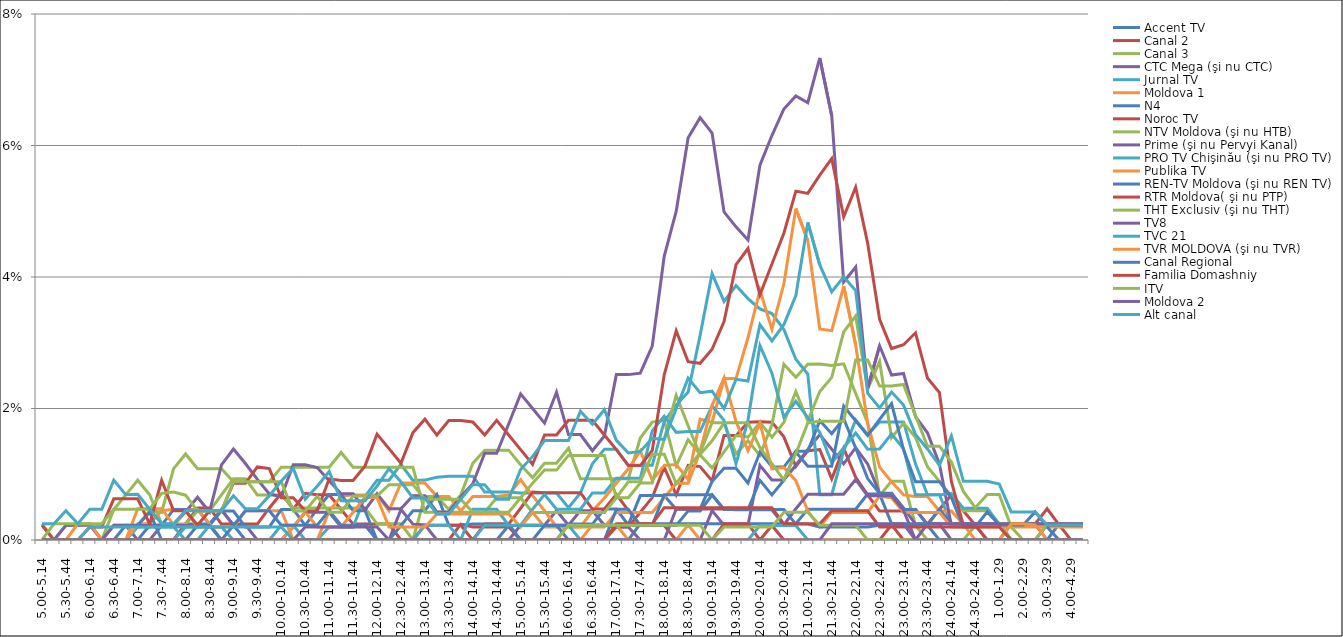
| Category | Accent TV | Canal 2 | Canal 3 | CTC Mega (şi nu CTC) | Jurnal TV | Moldova 1 | N4 | Noroc TV | NTV Moldova (şi nu HTB) | Prime (şi nu Pervyi Kanal) | PRO TV Chişinău (şi nu PRO TV) | Publika TV  | REN-TV Moldova (şi nu REN TV)  | RTR Moldova( şi nu PTP)  | THT Exclusiv (şi nu THT) | TV8 | TVC 21 | TVR MOLDOVA (şi nu TVR) | Canal Regional | Familia Domashniy | ITV | Moldova 2 | Alt canal |
|---|---|---|---|---|---|---|---|---|---|---|---|---|---|---|---|---|---|---|---|---|---|---|---|
| 5.00-5.14 | 0 | 0 | 0 | 0 | 0 | 0 | 0 | 0 | 0 | 0 | 0 | 0.002 | 0 | 0.002 | 0 | 0 | 0 | 0 | 0 | 0 | 0 | 0 | 0.002 |
| 5.15-5.29 | 0 | 0 | 0 | 0 | 0 | 0 | 0 | 0 | 0 | 0 | 0 | 0 | 0 | 0 | 0.002 | 0 | 0 | 0 | 0 | 0 | 0 | 0 | 0.002 |
| 5.30-5.44 | 0 | 0 | 0.002 | 0 | 0 | 0 | 0 | 0 | 0 | 0.002 | 0 | 0 | 0 | 0 | 0.002 | 0 | 0 | 0 | 0 | 0 | 0 | 0 | 0.004 |
| 5.45-5.59 | 0 | 0 | 0.002 | 0 | 0 | 0 | 0 | 0 | 0 | 0.002 | 0 | 0.002 | 0 | 0 | 0.002 | 0 | 0 | 0 | 0 | 0 | 0 | 0 | 0.002 |
| 6.00-6.14 | 0 | 0 | 0.002 | 0 | 0 | 0 | 0 | 0 | 0 | 0.002 | 0 | 0.002 | 0 | 0.002 | 0.002 | 0 | 0.002 | 0 | 0 | 0 | 0 | 0 | 0.005 |
| 6.15-6.29 | 0 | 0 | 0 | 0 | 0 | 0 | 0 | 0 | 0 | 0 | 0 | 0 | 0 | 0.002 | 0.002 | 0 | 0.002 | 0 | 0 | 0 | 0 | 0 | 0.005 |
| 6.30-6.44 | 0 | 0 | 0.005 | 0.002 | 0 | 0 | 0 | 0 | 0.002 | 0.002 | 0 | 0 | 0 | 0.006 | 0.005 | 0 | 0.002 | 0 | 0 | 0 | 0 | 0 | 0.009 |
| 6.45-6.59 | 0 | 0 | 0.007 | 0.002 | 0 | 0 | 0 | 0 | 0.002 | 0.002 | 0 | 0 | 0.002 | 0.006 | 0.005 | 0 | 0.002 | 0 | 0 | 0 | 0 | 0 | 0.007 |
| 7.00-7.14 | 0 | 0 | 0.009 | 0 | 0.002 | 0.002 | 0 | 0 | 0.002 | 0.002 | 0 | 0.005 | 0.002 | 0.006 | 0.005 | 0 | 0.002 | 0 | 0 | 0 | 0 | 0 | 0.007 |
| 7.15-7.29 | 0 | 0 | 0.007 | 0 | 0.002 | 0.002 | 0.002 | 0 | 0.004 | 0.002 | 0 | 0.005 | 0.004 | 0.002 | 0.005 | 0 | 0.002 | 0 | 0 | 0 | 0 | 0 | 0.005 |
| 7.30-7.44 | 0 | 0 | 0.002 | 0.002 | 0.002 | 0.004 | 0.002 | 0 | 0.004 | 0.002 | 0 | 0.005 | 0 | 0.009 | 0.007 | 0 | 0.002 | 0 | 0 | 0 | 0 | 0 | 0.002 |
| 7.45-7.59 | 0 | 0 | 0.002 | 0.002 | 0.002 | 0.005 | 0.005 | 0 | 0.011 | 0.002 | 0 | 0.002 | 0 | 0.004 | 0.007 | 0 | 0.002 | 0 | 0 | 0 | 0 | 0 | 0.002 |
| 8.00-8.14 | 0.002 | 0.002 | 0.002 | 0.002 | 0 | 0.004 | 0.005 | 0 | 0.013 | 0.004 | 0.002 | 0.005 | 0 | 0.004 | 0.007 | 0 | 0.002 | 0 | 0 | 0 | 0 | 0 | 0.004 |
| 8.15-8.29 | 0.002 | 0.005 | 0.004 | 0.002 | 0 | 0.002 | 0.005 | 0 | 0.011 | 0.007 | 0.002 | 0.005 | 0.002 | 0.002 | 0.004 | 0 | 0.002 | 0 | 0 | 0 | 0 | 0 | 0.004 |
| 8.30-8.44 | 0.002 | 0.005 | 0.004 | 0.002 | 0.002 | 0.002 | 0.002 | 0 | 0.011 | 0.004 | 0.002 | 0.002 | 0.002 | 0.004 | 0.004 | 0 | 0.002 | 0 | 0 | 0 | 0 | 0 | 0.004 |
| 8.45-8.59 | 0.005 | 0.002 | 0.007 | 0.005 | 0 | 0.002 | 0.004 | 0 | 0.011 | 0.011 | 0.002 | 0 | 0 | 0.004 | 0.004 | 0 | 0.002 | 0 | 0 | 0 | 0 | 0 | 0.004 |
| 9.00-9.14 | 0.002 | 0.002 | 0.009 | 0.002 | 0 | 0.002 | 0.004 | 0 | 0.009 | 0.014 | 0 | 0 | 0.002 | 0.009 | 0.009 | 0 | 0.002 | 0 | 0 | 0 | 0 | 0 | 0.007 |
| 9.15-9.29 | 0 | 0.002 | 0.009 | 0.002 | 0 | 0.004 | 0.002 | 0 | 0.009 | 0.012 | 0 | 0 | 0.004 | 0.009 | 0.009 | 0 | 0.002 | 0 | 0 | 0 | 0 | 0 | 0.005 |
| 9.30-9.44 | 0 | 0.002 | 0.007 | 0 | 0 | 0.004 | 0.002 | 0 | 0.009 | 0.009 | 0 | 0 | 0.004 | 0.011 | 0.009 | 0 | 0.002 | 0 | 0 | 0 | 0 | 0 | 0.005 |
| 9.45-9.59 | 0 | 0.005 | 0.007 | 0 | 0 | 0.004 | 0.002 | 0 | 0.009 | 0.007 | 0 | 0 | 0.004 | 0.011 | 0.009 | 0 | 0.002 | 0 | 0 | 0 | 0 | 0 | 0.007 |
| 10.00-10.14 | 0 | 0.007 | 0.007 | 0 | 0.002 | 0.004 | 0.005 | 0 | 0.011 | 0.007 | 0 | 0 | 0.002 | 0.006 | 0.009 | 0 | 0.002 | 0 | 0 | 0 | 0 | 0 | 0.009 |
| 10.15-10.29 | 0 | 0.005 | 0.005 | 0.002 | 0.002 | 0 | 0.005 | 0 | 0.011 | 0.011 | 0 | 0.002 | 0.002 | 0.006 | 0.004 | 0 | 0 | 0 | 0 | 0 | 0 | 0 | 0.011 |
| 10.30-10.44 | 0 | 0.007 | 0.005 | 0.004 | 0 | 0 | 0.002 | 0 | 0.011 | 0.011 | 0 | 0.004 | 0.002 | 0.004 | 0.004 | 0.002 | 0 | 0 | 0 | 0 | 0 | 0 | 0.006 |
| 10.45-10.59 | 0 | 0.007 | 0.005 | 0.004 | 0 | 0 | 0.005 | 0 | 0.011 | 0.011 | 0 | 0.002 | 0.002 | 0.004 | 0.007 | 0.002 | 0 | 0 | 0 | 0 | 0 | 0 | 0.008 |
| 11.00-11.14 | 0 | 0.007 | 0.005 | 0.004 | 0.002 | 0.004 | 0.007 | 0 | 0.011 | 0.009 | 0 | 0.002 | 0.004 | 0.009 | 0.004 | 0.002 | 0 | 0 | 0 | 0 | 0 | 0 | 0.01 |
| 11.15-11.29 | 0 | 0.005 | 0.005 | 0.002 | 0.002 | 0.007 | 0.007 | 0 | 0.013 | 0.007 | 0 | 0.002 | 0.002 | 0.009 | 0.004 | 0.002 | 0 | 0 | 0 | 0 | 0 | 0 | 0.006 |
| 11.30-11.44 | 0 | 0.002 | 0.005 | 0.002 | 0.002 | 0.007 | 0.004 | 0 | 0.011 | 0.007 | 0 | 0.004 | 0.002 | 0.009 | 0.007 | 0.002 | 0 | 0 | 0 | 0 | 0 | 0 | 0.006 |
| 11.45-11.59 | 0 | 0.002 | 0.005 | 0.002 | 0.007 | 0.007 | 0.004 | 0 | 0.011 | 0.005 | 0 | 0.006 | 0.002 | 0.011 | 0.007 | 0.002 | 0 | 0 | 0 | 0 | 0 | 0 | 0.006 |
| 12.00-12.14 | 0 | 0.002 | 0.002 | 0 | 0.009 | 0.007 | 0 | 0 | 0.011 | 0.007 | 0 | 0.006 | 0 | 0.016 | 0.007 | 0.002 | 0 | 0 | 0 | 0 | 0 | 0 | 0.008 |
| 12.15-12.29 | 0 | 0.002 | 0.002 | 0 | 0.009 | 0.004 | 0 | 0 | 0.011 | 0.005 | 0 | 0.002 | 0 | 0.014 | 0.008 | 0 | 0 | 0 | 0 | 0 | 0 | 0 | 0.011 |
| 12.30-12.44 | 0 | 0 | 0.002 | 0.005 | 0.012 | 0.009 | 0.002 | 0 | 0.011 | 0.005 | 0 | 0.002 | 0 | 0.012 | 0.008 | 0 | 0 | 0 | 0 | 0 | 0 | 0 | 0.009 |
| 12.45-12.59 | 0 | 0 | 0 | 0.002 | 0.009 | 0.009 | 0.004 | 0 | 0.011 | 0.007 | 0 | 0.002 | 0 | 0.016 | 0.008 | 0 | 0 | 0 | 0 | 0 | 0 | 0 | 0.006 |
| 13.00-13.14 | 0 | 0 | 0.007 | 0.002 | 0.009 | 0.009 | 0.004 | 0.002 | 0.004 | 0.007 | 0.002 | 0.002 | 0 | 0.018 | 0.006 | 0 | 0 | 0 | 0 | 0 | 0 | 0 | 0.006 |
| 13.15-13.29 | 0 | 0 | 0.007 | 0 | 0.01 | 0.007 | 0.007 | 0.002 | 0.004 | 0.004 | 0.002 | 0.004 | 0 | 0.016 | 0.006 | 0 | 0 | 0 | 0 | 0 | 0 | 0 | 0.004 |
| 13.30-13.44 | 0 | 0 | 0.005 | 0 | 0.01 | 0.007 | 0.002 | 0.002 | 0.004 | 0.004 | 0.002 | 0.004 | 0 | 0.018 | 0.006 | 0 | 0 | 0 | 0 | 0 | 0 | 0 | 0.004 |
| 13.45-13.59 | 0 | 0.002 | 0.007 | 0 | 0.01 | 0.004 | 0.002 | 0.002 | 0.004 | 0.007 | 0 | 0.004 | 0 | 0.018 | 0.006 | 0 | 0 | 0 | 0 | 0 | 0 | 0 | 0.006 |
| 14.00-14.14 | 0 | 0.002 | 0.012 | 0 | 0.01 | 0.007 | 0.002 | 0 | 0.004 | 0.009 | 0.005 | 0.004 | 0 | 0.018 | 0.004 | 0 | 0 | 0 | 0 | 0 | 0 | 0 | 0.008 |
| 14.15-14.29 | 0 | 0.002 | 0.014 | 0 | 0.007 | 0.007 | 0.002 | 0.002 | 0.004 | 0.013 | 0.005 | 0.004 | 0 | 0.016 | 0.004 | 0 | 0.002 | 0 | 0 | 0 | 0 | 0 | 0.008 |
| 14.30-14.44 | 0 | 0.002 | 0.014 | 0 | 0.007 | 0.007 | 0.002 | 0.002 | 0.006 | 0.013 | 0.005 | 0.004 | 0 | 0.018 | 0.004 | 0 | 0.002 | 0 | 0 | 0 | 0 | 0 | 0.006 |
| 14.45-14.59 | 0 | 0.002 | 0.014 | 0 | 0.007 | 0.007 | 0.002 | 0.002 | 0.006 | 0.018 | 0.002 | 0.004 | 0.002 | 0.016 | 0.004 | 0 | 0.002 | 0 | 0 | 0 | 0 | 0 | 0.006 |
| 15.00-15.14 | 0 | 0 | 0.011 | 0.002 | 0.007 | 0.009 | 0 | 0.005 | 0.006 | 0.022 | 0.002 | 0.002 | 0.002 | 0.014 | 0.006 | 0 | 0.002 | 0 | 0 | 0 | 0 | 0 | 0.011 |
| 15.15-15.29 | 0 | 0 | 0.009 | 0.002 | 0.007 | 0.007 | 0 | 0.007 | 0.004 | 0.02 | 0.005 | 0.004 | 0.002 | 0.012 | 0.009 | 0 | 0.002 | 0 | 0 | 0 | 0 | 0 | 0.013 |
| 15.30-15.44 | 0 | 0 | 0.012 | 0.002 | 0.007 | 0.004 | 0 | 0.007 | 0.004 | 0.018 | 0.007 | 0.002 | 0.002 | 0.016 | 0.011 | 0 | 0.002 | 0 | 0.002 | 0 | 0 | 0 | 0.015 |
| 15.45-15.59 | 0 | 0 | 0.012 | 0.004 | 0.007 | 0.002 | 0 | 0.007 | 0.004 | 0.022 | 0.005 | 0.002 | 0.002 | 0.016 | 0.011 | 0 | 0.002 | 0 | 0.002 | 0 | 0 | 0 | 0.015 |
| 16.00-16.14 | 0 | 0 | 0.014 | 0.002 | 0.005 | 0.002 | 0.002 | 0.007 | 0.004 | 0.016 | 0.005 | 0.002 | 0 | 0.018 | 0.013 | 0 | 0.002 | 0 | 0.002 | 0 | 0.002 | 0 | 0.015 |
| 16.15-16.29 | 0 | 0 | 0.009 | 0.004 | 0.007 | 0.002 | 0.002 | 0.007 | 0.004 | 0.016 | 0.005 | 0.002 | 0 | 0.018 | 0.013 | 0 | 0 | 0 | 0.002 | 0 | 0.002 | 0 | 0.02 |
| 16.30-16.44 | 0 | 0 | 0.009 | 0.004 | 0.012 | 0.004 | 0.002 | 0.005 | 0.004 | 0.014 | 0.007 | 0.002 | 0 | 0.018 | 0.013 | 0 | 0 | 0.002 | 0.002 | 0 | 0.002 | 0 | 0.018 |
| 16.45-16.59 | 0 | 0 | 0.009 | 0.002 | 0.014 | 0.006 | 0.005 | 0.005 | 0.004 | 0.016 | 0.007 | 0.002 | 0 | 0.016 | 0.013 | 0 | 0 | 0.002 | 0.002 | 0 | 0.002 | 0 | 0.02 |
| 17.00-17.14 | 0 | 0.002 | 0.009 | 0.002 | 0.014 | 0.009 | 0.005 | 0.007 | 0.006 | 0.025 | 0.009 | 0.004 | 0.005 | 0.014 | 0.006 | 0 | 0 | 0.002 | 0.002 | 0.002 | 0.002 | 0 | 0.015 |
| 17.15-17.29 | 0 | 0.002 | 0.009 | 0.002 | 0.011 | 0.011 | 0.002 | 0.005 | 0.006 | 0.025 | 0.009 | 0.004 | 0.005 | 0.011 | 0.009 | 0 | 0 | 0 | 0.002 | 0.002 | 0.002 | 0 | 0.013 |
| 17.30-17.44 | 0.002 | 0.004 | 0.016 | 0 | 0.011 | 0.014 | 0.007 | 0.002 | 0.009 | 0.025 | 0.009 | 0.004 | 0.002 | 0.011 | 0.009 | 0 | 0 | 0 | 0.002 | 0.002 | 0.002 | 0 | 0.013 |
| 17.45-17.59 | 0.002 | 0.006 | 0.018 | 0 | 0.011 | 0.009 | 0.007 | 0.002 | 0.009 | 0.029 | 0.017 | 0.004 | 0.002 | 0.014 | 0.013 | 0 | 0 | 0 | 0.002 | 0.002 | 0.002 | 0 | 0.015 |
| 18.00-18.14 | 0.002 | 0.011 | 0.018 | 0 | 0.018 | 0.011 | 0.007 | 0.002 | 0.015 | 0.043 | 0.019 | 0.006 | 0.002 | 0.025 | 0.013 | 0 | 0 | 0 | 0.007 | 0.005 | 0.002 | 0 | 0.015 |
| 18.15-18.29 | 0.002 | 0.007 | 0.011 | 0 | 0.021 | 0.011 | 0.005 | 0 | 0.022 | 0.05 | 0.016 | 0.009 | 0.002 | 0.032 | 0.009 | 0.005 | 0 | 0 | 0.007 | 0.005 | 0.002 | 0 | 0.02 |
| 18.30-18.44 | 0.002 | 0.011 | 0.015 | 0 | 0.022 | 0.009 | 0.005 | 0 | 0.017 | 0.061 | 0.016 | 0.009 | 0.004 | 0.027 | 0.011 | 0.005 | 0 | 0.002 | 0.007 | 0.005 | 0.002 | 0 | 0.025 |
| 18.45-18.59 | 0.002 | 0.011 | 0.013 | 0 | 0.031 | 0.018 | 0.005 | 0 | 0.013 | 0.064 | 0.016 | 0.014 | 0.004 | 0.027 | 0.013 | 0.005 | 0 | 0 | 0.007 | 0.005 | 0.002 | 0 | 0.022 |
| 19.00-19.14 | 0.002 | 0.009 | 0.015 | 0.004 | 0.041 | 0.018 | 0.009 | 0 | 0.011 | 0.062 | 0.02 | 0.02 | 0.007 | 0.029 | 0.018 | 0.005 | 0 | 0 | 0.007 | 0.005 | 0 | 0 | 0.023 |
| 19.15-19.29 | 0.002 | 0.016 | 0.018 | 0.002 | 0.036 | 0.025 | 0.011 | 0.002 | 0.013 | 0.05 | 0.018 | 0.025 | 0.005 | 0.033 | 0.018 | 0.005 | 0 | 0 | 0.005 | 0.005 | 0.002 | 0 | 0.02 |
| 19.30-19.44 | 0.002 | 0.016 | 0.013 | 0.002 | 0.039 | 0.025 | 0.011 | 0.002 | 0.016 | 0.048 | 0.012 | 0.018 | 0.005 | 0.042 | 0.018 | 0.005 | 0 | 0 | 0.005 | 0.005 | 0.002 | 0 | 0.024 |
| 19.45-19.59 | 0.002 | 0.018 | 0.015 | 0.002 | 0.037 | 0.031 | 0.009 | 0.002 | 0.016 | 0.046 | 0.018 | 0.014 | 0.005 | 0.044 | 0.018 | 0.005 | 0 | 0 | 0.005 | 0.005 | 0.002 | 0 | 0.024 |
| 20.00-20.14 | 0.002 | 0.018 | 0.013 | 0.011 | 0.035 | 0.038 | 0.013 | 0 | 0.018 | 0.057 | 0.03 | 0.018 | 0.009 | 0.037 | 0.014 | 0.005 | 0.002 | 0 | 0.005 | 0.005 | 0.002 | 0 | 0.033 |
| 20.15-20.29 | 0.002 | 0.018 | 0.018 | 0.009 | 0.034 | 0.032 | 0.011 | 0.002 | 0.016 | 0.062 | 0.025 | 0.011 | 0.007 | 0.042 | 0.012 | 0.005 | 0.002 | 0 | 0.005 | 0.005 | 0.002 | 0 | 0.03 |
| 20.30-20.44 | 0.002 | 0.016 | 0.027 | 0.009 | 0.032 | 0.039 | 0.011 | 0 | 0.018 | 0.066 | 0.019 | 0.011 | 0.009 | 0.047 | 0.009 | 0.002 | 0.002 | 0 | 0.005 | 0.002 | 0.004 | 0 | 0.033 |
| 20.45-20.59 | 0.002 | 0.011 | 0.025 | 0.011 | 0.027 | 0.05 | 0.014 | 0 | 0.023 | 0.068 | 0.021 | 0.009 | 0.013 | 0.053 | 0.013 | 0.005 | 0.002 | 0 | 0.002 | 0.002 | 0.004 | 0 | 0.037 |
| 21.00-21.14 | 0.005 | 0.014 | 0.027 | 0.014 | 0.025 | 0.046 | 0.014 | 0 | 0.018 | 0.067 | 0.019 | 0.004 | 0.011 | 0.053 | 0.018 | 0.007 | 0 | 0 | 0.002 | 0.002 | 0.004 | 0 | 0.048 |
| 21.15-21.29 | 0.005 | 0.014 | 0.027 | 0.016 | 0.007 | 0.032 | 0.018 | 0 | 0.023 | 0.073 | 0.016 | 0.002 | 0.011 | 0.055 | 0.018 | 0.007 | 0 | 0 | 0.002 | 0.002 | 0.002 | 0 | 0.042 |
| 21.30-21.44 | 0.005 | 0.009 | 0.027 | 0.014 | 0.007 | 0.032 | 0.016 | 0 | 0.025 | 0.065 | 0.012 | 0.004 | 0.011 | 0.058 | 0.018 | 0.007 | 0 | 0 | 0.002 | 0.004 | 0.002 | 0.002 | 0.038 |
| 21.45-21.59 | 0.005 | 0.014 | 0.027 | 0.012 | 0.014 | 0.039 | 0.018 | 0 | 0.032 | 0.039 | 0.014 | 0.004 | 0.02 | 0.049 | 0.018 | 0.007 | 0 | 0 | 0.002 | 0.004 | 0.002 | 0.002 | 0.04 |
| 22.00-22.14 | 0.005 | 0.01 | 0.022 | 0.014 | 0.018 | 0.03 | 0.014 | 0 | 0.034 | 0.042 | 0.016 | 0.004 | 0.018 | 0.054 | 0.027 | 0.009 | 0 | 0 | 0.002 | 0.004 | 0.002 | 0.002 | 0.038 |
| 22.15-22.29 | 0.007 | 0.007 | 0.018 | 0.012 | 0.016 | 0.018 | 0.009 | 0 | 0.023 | 0.023 | 0.014 | 0.004 | 0.016 | 0.045 | 0.027 | 0.007 | 0 | 0 | 0.002 | 0.004 | 0 | 0.002 | 0.022 |
| 22.30-22.44 | 0.007 | 0.004 | 0.007 | 0.007 | 0.018 | 0.011 | 0.007 | 0 | 0.027 | 0.03 | 0.014 | 0.007 | 0.018 | 0.034 | 0.023 | 0.007 | 0 | 0 | 0.002 | 0.002 | 0 | 0.002 | 0.02 |
| 22.45-22.59 | 0.002 | 0.004 | 0.009 | 0.007 | 0.018 | 0.009 | 0.007 | 0.002 | 0.016 | 0.025 | 0.016 | 0.006 | 0.021 | 0.029 | 0.023 | 0.007 | 0 | 0 | 0.002 | 0.002 | 0 | 0.002 | 0.023 |
| 23.00-23.14 | 0.002 | 0.004 | 0.009 | 0.005 | 0.018 | 0.007 | 0.005 | 0 | 0.018 | 0.025 | 0.014 | 0.004 | 0.014 | 0.03 | 0.024 | 0.005 | 0 | 0 | 0.002 | 0.002 | 0 | 0.002 | 0.021 |
| 23.15-23.29 | 0.002 | 0.005 | 0.002 | 0.002 | 0.012 | 0.007 | 0.005 | 0 | 0.016 | 0.019 | 0.007 | 0.004 | 0.009 | 0.032 | 0.019 | 0 | 0 | 0 | 0.002 | 0.002 | 0 | 0 | 0.016 |
| 23.30-23.44 | 0.002 | 0.002 | 0 | 0.002 | 0.007 | 0.007 | 0.002 | 0 | 0.011 | 0.016 | 0.007 | 0.004 | 0.009 | 0.025 | 0.014 | 0.002 | 0 | 0 | 0.002 | 0.002 | 0 | 0 | 0.014 |
| 23.45-23.59 | 0.002 | 0.005 | 0 | 0.002 | 0.007 | 0.004 | 0.005 | 0 | 0.009 | 0.012 | 0.007 | 0.004 | 0.009 | 0.022 | 0.014 | 0.002 | 0 | 0 | 0 | 0.002 | 0 | 0 | 0.011 |
| 24.00-24.14 | 0.002 | 0.007 | 0 | 0 | 0.002 | 0.004 | 0.002 | 0 | 0.007 | 0.002 | 0.007 | 0.002 | 0.006 | 0.009 | 0.012 | 0.002 | 0 | 0 | 0 | 0.002 | 0 | 0 | 0.016 |
| 24.15-24.29 | 0.002 | 0.004 | 0 | 0 | 0.002 | 0.002 | 0.002 | 0 | 0.004 | 0.002 | 0.005 | 0.002 | 0.002 | 0.002 | 0.007 | 0.002 | 0 | 0 | 0 | 0.002 | 0 | 0 | 0.009 |
| 24.30-24.44 | 0.002 | 0.002 | 0.002 | 0 | 0.002 | 0 | 0.002 | 0 | 0.004 | 0.002 | 0.005 | 0.002 | 0.002 | 0.002 | 0.005 | 0.002 | 0 | 0 | 0 | 0.002 | 0 | 0 | 0.009 |
| 24.45-24.59 | 0.002 | 0.002 | 0.002 | 0 | 0.002 | 0 | 0.002 | 0 | 0.004 | 0 | 0.005 | 0.002 | 0.004 | 0 | 0.007 | 0.002 | 0 | 0 | 0 | 0.002 | 0 | 0 | 0.009 |
| 1.00-1.29 | 0.002 | 0.002 | 0.002 | 0 | 0.002 | 0 | 0.002 | 0 | 0.002 | 0 | 0.002 | 0.002 | 0.002 | 0 | 0.007 | 0.002 | 0 | 0 | 0 | 0.002 | 0 | 0 | 0.008 |
| 1.30-1. 59 | 0 | 0 | 0.002 | 0 | 0.002 | 0 | 0 | 0.002 | 0 | 0 | 0.002 | 0.002 | 0.002 | 0 | 0.002 | 0.002 | 0 | 0.002 | 0 | 0 | 0 | 0 | 0.004 |
| 2.00-2.29 | 0 | 0 | 0.002 | 0 | 0.002 | 0 | 0 | 0.002 | 0 | 0 | 0.002 | 0.002 | 0.002 | 0 | 0 | 0.002 | 0 | 0.002 | 0 | 0 | 0 | 0 | 0.004 |
| 2.30-2.59 | 0 | 0 | 0.002 | 0 | 0.002 | 0 | 0 | 0.002 | 0 | 0 | 0.002 | 0.002 | 0.004 | 0 | 0 | 0.002 | 0 | 0.002 | 0 | 0 | 0 | 0 | 0.004 |
| 3.00-3.29 | 0 | 0 | 0.002 | 0 | 0 | 0 | 0 | 0.005 | 0 | 0 | 0.002 | 0.002 | 0.002 | 0.002 | 0.002 | 0.002 | 0 | 0 | 0 | 0 | 0 | 0 | 0.002 |
| 3.30-3.59 | 0 | 0 | 0.002 | 0 | 0 | 0 | 0.002 | 0.002 | 0 | 0 | 0.002 | 0.002 | 0 | 0.002 | 0.002 | 0.002 | 0 | 0 | 0 | 0 | 0 | 0 | 0.002 |
| 4.00-4.29 | 0 | 0 | 0.002 | 0 | 0 | 0 | 0.002 | 0 | 0 | 0 | 0.002 | 0.002 | 0 | 0.002 | 0.002 | 0.002 | 0 | 0 | 0 | 0 | 0 | 0 | 0.002 |
| 4.30-4.59 | 0 | 0 | 0.002 | 0 | 0 | 0 | 0.002 | 0 | 0 | 0 | 0.002 | 0.002 | 0 | 0.002 | 0.002 | 0.002 | 0 | 0 | 0 | 0 | 0 | 0 | 0.002 |